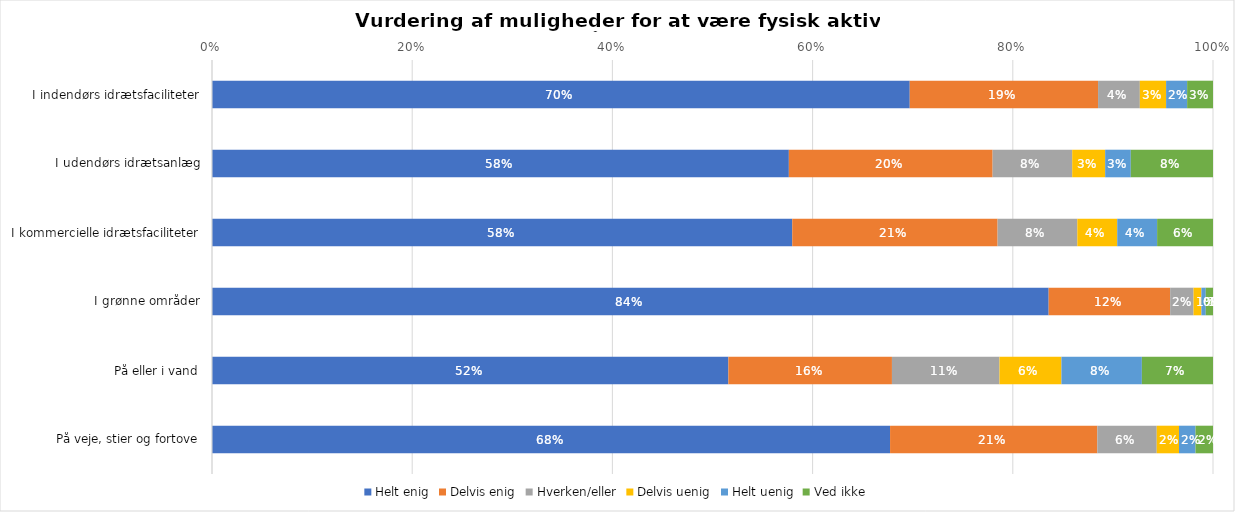
| Category | Helt enig | Delvis enig | Hverken/eller | Delvis uenig | Helt uenig | Ved ikke |
|---|---|---|---|---|---|---|
| I indendørs idrætsfaciliteter | 0.697 | 0.188 | 0.042 | 0.026 | 0.021 | 0.026 |
| I udendørs idrætsanlæg | 0.576 | 0.204 | 0.079 | 0.033 | 0.026 | 0.082 |
| I kommercielle idrætsfaciliteter | 0.58 | 0.205 | 0.08 | 0.04 | 0.04 | 0.056 |
| I grønne områder | 0.836 | 0.121 | 0.023 | 0.008 | 0.004 | 0.007 |
| På eller i vand | 0.516 | 0.163 | 0.107 | 0.062 | 0.08 | 0.071 |
| På veje, stier og fortove | 0.677 | 0.207 | 0.059 | 0.022 | 0.016 | 0.017 |